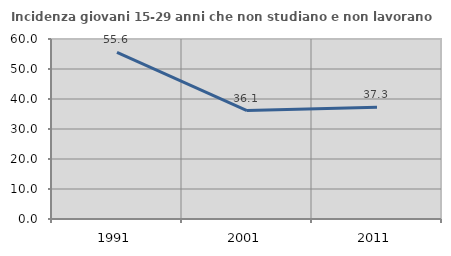
| Category | Incidenza giovani 15-29 anni che non studiano e non lavorano  |
|---|---|
| 1991.0 | 55.556 |
| 2001.0 | 36.128 |
| 2011.0 | 37.265 |